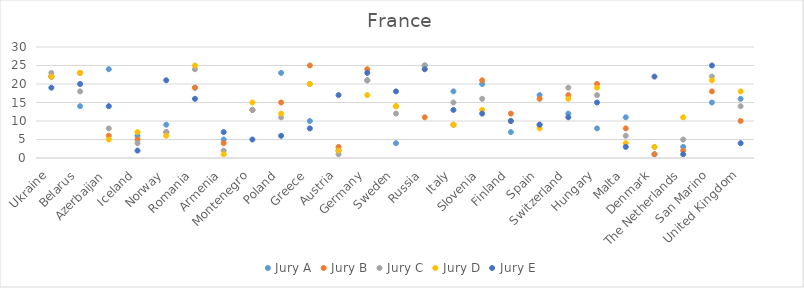
| Category | Jury A | Jury B | Jury C | Jury D | Jury E |
|---|---|---|---|---|---|
| Ukraine | 22 | 22 | 23 | 22 | 19 |
| Belarus | 14 | 23 | 18 | 23 | 20 |
| Azerbaijan | 24 | 6 | 8 | 5 | 14 |
| Iceland | 6 | 5 | 4 | 7 | 2 |
| Norway | 9 | 7 | 7 | 6 | 21 |
| Romania | 19 | 19 | 24 | 25 | 16 |
| Armenia | 5 | 4 | 2 | 1 | 7 |
| Montenegro | 13 | 13 | 13 | 15 | 5 |
| Poland | 23 | 15 | 11 | 12 | 6 |
| Greece | 10 | 25 | 20 | 20 | 8 |
| Austria | 2 | 3 | 1 | 2 | 17 |
| Germany | 21 | 24 | 21 | 17 | 23 |
| Sweden | 4 | 14 | 12 | 14 | 18 |
| Russia | 25 | 11 | 25 | 24 | 24 |
| Italy | 18 | 9 | 15 | 9 | 13 |
| Slovenia | 20 | 21 | 16 | 13 | 12 |
| Finland | 7 | 12 | 10 | 10 | 10 |
| Spain | 17 | 16 | 9 | 8 | 9 |
| Switzerland | 12 | 17 | 19 | 16 | 11 |
| Hungary | 8 | 20 | 17 | 19 | 15 |
| Malta | 11 | 8 | 6 | 4 | 3 |
| Denmark | 1 | 1 | 3 | 3 | 22 |
| The Netherlands | 3 | 2 | 5 | 11 | 1 |
| San Marino | 15 | 18 | 22 | 21 | 25 |
| United Kingdom | 16 | 10 | 14 | 18 | 4 |